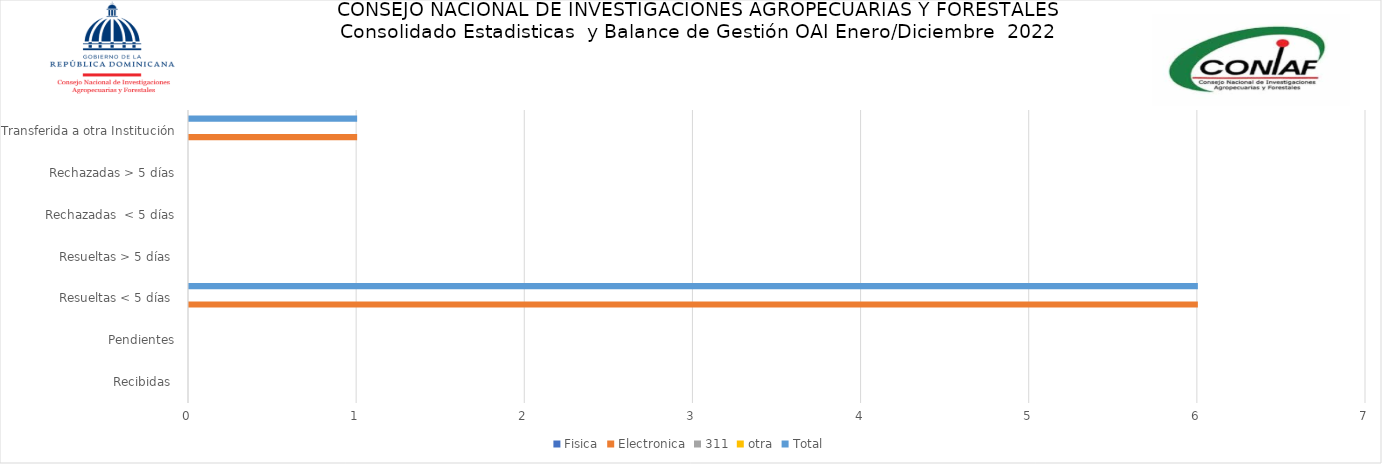
| Category | Fisica | Electronica | 311 | otra | Total |
|---|---|---|---|---|---|
| Recibidas  | 0 | 0 | 0 | 0 | 0 |
| Pendientes | 0 | 0 | 0 | 0 | 0 |
| Resueltas < 5 días  | 0 | 6 | 0 | 0 | 6 |
| Resueltas > 5 días  | 0 | 0 | 0 | 0 | 0 |
| Rechazadas  < 5 días | 0 | 0 | 0 | 0 | 0 |
| Rechazadas > 5 días | 0 | 0 | 0 | 0 | 0 |
| Transferida a otra Institución | 0 | 1 | 0 | 0 | 1 |